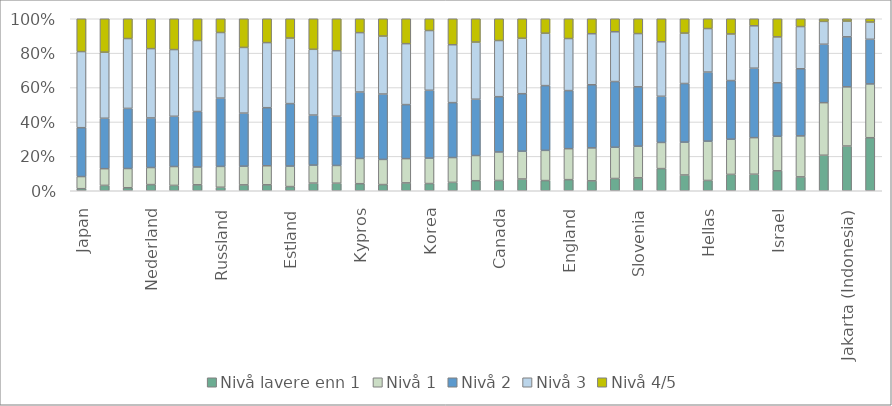
| Category | Nivå lavere enn 1 | Nivå 1 | Nivå 2 | Nivå 3 | Nivå 4/5 |
|---|---|---|---|---|---|
| Japan | 1.177 | 6.973 | 28.055 | 43.713 | 18.846 |
| Finland | 3.118 | 9.715 | 29.316 | 38.415 | 19.436 |
| Tsjekkia | 1.735 | 11.119 | 34.728 | 40.36 | 11.438 |
| Nederland | 3.495 | 9.702 | 28.178 | 39.389 | 16.975 |
| Flandern (Belgia) | 2.953 | 10.403 | 27.703 | 36.796 | 16.992 |
| Slovakia | 3.454 | 10.316 | 32.17 | 41.149 | 12.64 |
| Russland | 2.032 | 12.123 | 39.702 | 38.14 | 8.003 |
| Danmark | 3.409 | 10.826 | 30.728 | 38.046 | 16.607 |
| Østerrike | 3.401 | 10.863 | 33.136 | 37.155 | 13.617 |
| Estland | 2.411 | 11.884 | 36.177 | 37.974 | 11.172 |
| Norge | 4.338 | 10.235 | 28.438 | 37.375 | 17.368 |
| Sverige | 4.385 | 10.318 | 28.654 | 38.049 | 18.594 |
| Kypros | 3.376 | 12.085 | 31.786 | 28.422 | 6.64 |
| Litauen | 3.434 | 13.978 | 36.319 | 32.205 | 9.612 |
| Tyskland | 4.508 | 13.886 | 30.951 | 34.916 | 14.263 |
| Korea | 4.181 | 14.728 | 39.353 | 34.643 | 6.828 |
| New Zealand | 4.779 | 14.165 | 31.31 | 33.024 | 14.818 |
| Australia | 5.729 | 14.363 | 32.101 | 32.601 | 13.297 |
| Canada | 5.908 | 16.445 | 31.864 | 32.363 | 12.546 |
| OECD | 6.738 | 15.968 | 32.988 | 31.82 | 11.189 |
| Polen | 5.916 | 17.561 | 37.651 | 30.459 | 8.413 |
| England | 6.362 | 17.758 | 33.312 | 29.846 | 11.344 |
| Nord-Irland | 5.634 | 18.739 | 35.888 | 29.027 | 8.502 |
| Irland | 7.086 | 18.092 | 38.009 | 28.817 | 7.527 |
| Slovenia | 7.476 | 18.297 | 34.328 | 30.763 | 8.57 |
| Singapore | 12.747 | 15.053 | 26.554 | 31.377 | 13.254 |
| Frankrike | 9.083 | 18.944 | 33.798 | 29.046 | 8.284 |
| Hellas | 5.92 | 22.627 | 39.766 | 25.05 | 5.647 |
| USA | 9.104 | 19.602 | 32.644 | 25.939 | 8.479 |
| Spania | 9.529 | 21.114 | 40.066 | 24.467 | 4.059 |
| Israel | 11.319 | 19.586 | 30.371 | 26.007 | 10.301 |
| Italia | 8.007 | 23.674 | 38.786 | 24.368 | 4.512 |
| Tyrkia | 20.235 | 29.958 | 33.295 | 13.032 | 1.497 |
| Jakarta (Indonesia) | 26.002 | 34.396 | 29.101 | 9.121 | 1.369 |
| Chile | 30.753 | 31.181 | 25.889 | 10 | 1.905 |